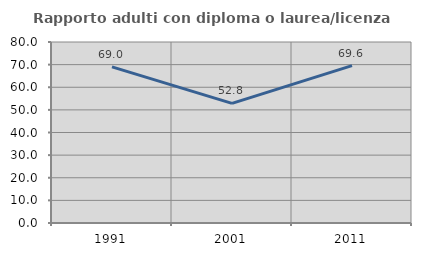
| Category | Rapporto adulti con diploma o laurea/licenza media  |
|---|---|
| 1991.0 | 68.987 |
| 2001.0 | 52.846 |
| 2011.0 | 69.565 |